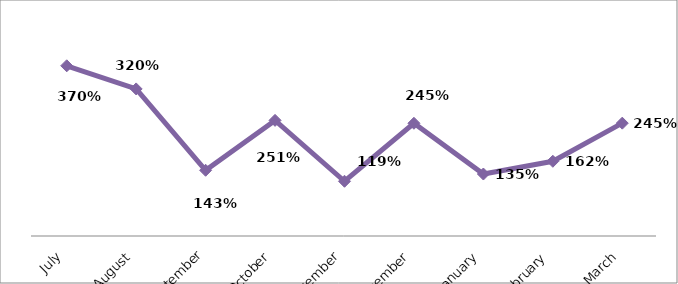
| Category | PERCENTAGE |
|---|---|
| July | 3.7 |
| August | 3.197 |
| September | 1.429 |
| October | 2.514 |
| November | 1.19 |
| December | 2.451 |
| January | 1.347 |
| February | 1.624 |
| March | 2.453 |